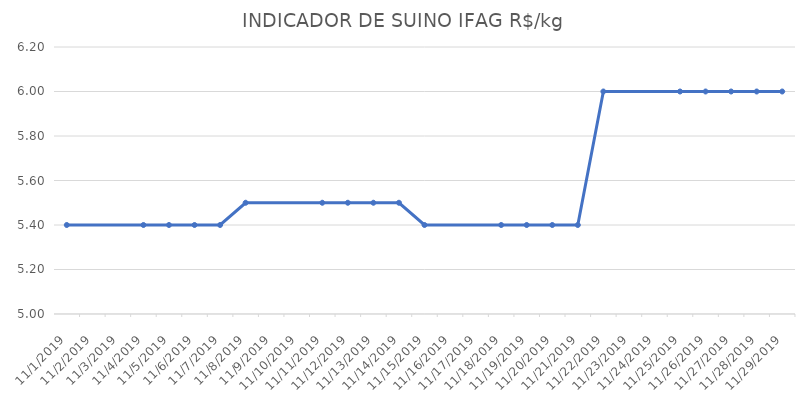
| Category | INDICADOR DE SUINO IFAG |
|---|---|
| 11/1/19 | 5.4 |
| 11/4/19 | 5.4 |
| 11/5/19 | 5.4 |
| 11/6/19 | 5.4 |
| 11/7/19 | 5.4 |
| 11/8/19 | 5.5 |
| 11/11/19 | 5.5 |
| 11/12/19 | 5.5 |
| 11/13/19 | 5.5 |
| 11/14/19 | 5.5 |
| 11/15/19 | 5.4 |
| 11/18/19 | 5.4 |
| 11/19/19 | 5.4 |
| 11/20/19 | 5.4 |
| 11/21/19 | 5.4 |
| 11/22/19 | 6 |
| 11/25/19 | 6 |
| 11/26/19 | 6 |
| 11/27/19 | 6 |
| 11/28/19 | 6 |
| 11/29/19 | 6 |